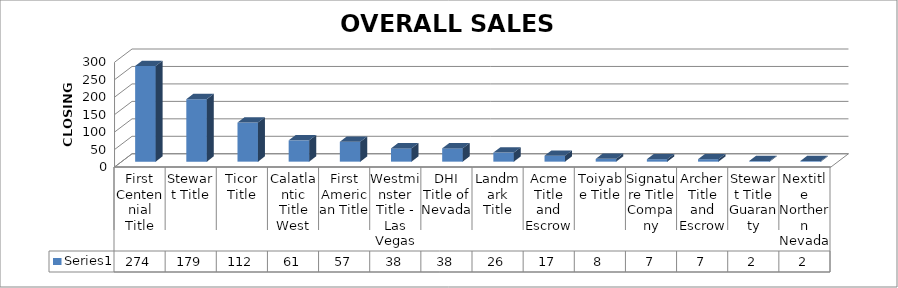
| Category | Series 0 |
|---|---|
| First Centennial Title | 274 |
| Stewart Title | 179 |
| Ticor Title | 112 |
| Calatlantic Title West | 61 |
| First American Title | 57 |
| Westminster Title - Las Vegas | 38 |
| DHI Title of Nevada | 38 |
| Landmark Title | 26 |
| Acme Title and Escrow | 17 |
| Toiyabe Title | 8 |
| Signature Title Company | 7 |
| Archer Title and Escrow | 7 |
| Stewart Title Guaranty | 2 |
| Nextitle Northern Nevada | 2 |